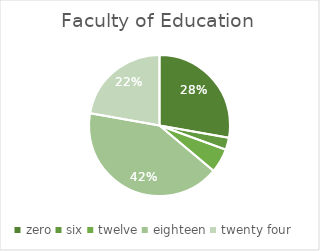
| Category | Series 0 |
|---|---|
| zero | 10 |
| six | 1 |
| twelve | 2 |
| eighteen | 15 |
| twenty four | 8 |